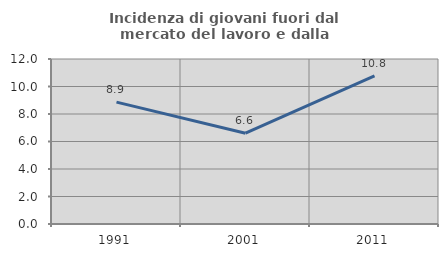
| Category | Incidenza di giovani fuori dal mercato del lavoro e dalla formazione  |
|---|---|
| 1991.0 | 8.861 |
| 2001.0 | 6.604 |
| 2011.0 | 10.769 |